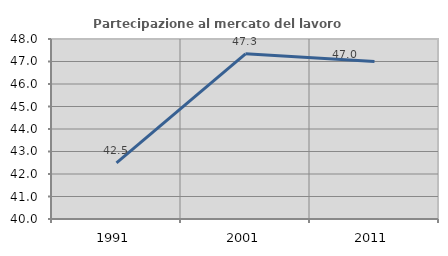
| Category | Partecipazione al mercato del lavoro  femminile |
|---|---|
| 1991.0 | 42.493 |
| 2001.0 | 47.342 |
| 2011.0 | 47 |